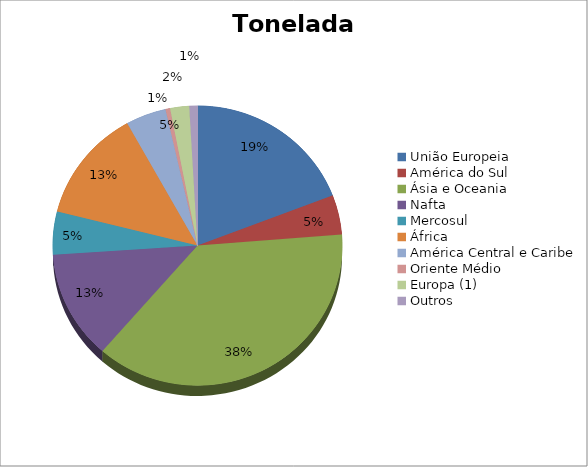
| Category | Series 0 |
|---|---|
| União Europeia | 925641.817 |
| América do Sul | 220907.705 |
| Ásia e Oceania | 1818559.623 |
| Nafta | 606717.822 |
| Mercosul | 239893.025 |
| África | 628030.995 |
| América Central e Caribe | 218035.85 |
| Oriente Médio | 24522.6 |
| Europa (1) | 103330.474 |
| Outros | 43824.321 |